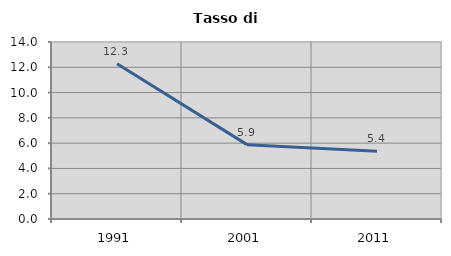
| Category | Tasso di disoccupazione   |
|---|---|
| 1991.0 | 12.273 |
| 2001.0 | 5.882 |
| 2011.0 | 5.366 |